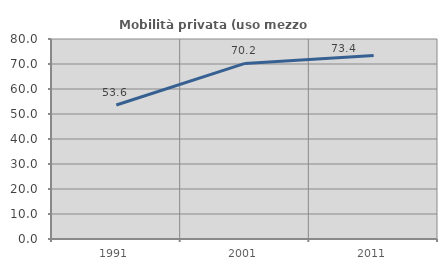
| Category | Mobilità privata (uso mezzo privato) |
|---|---|
| 1991.0 | 53.583 |
| 2001.0 | 70.228 |
| 2011.0 | 73.37 |